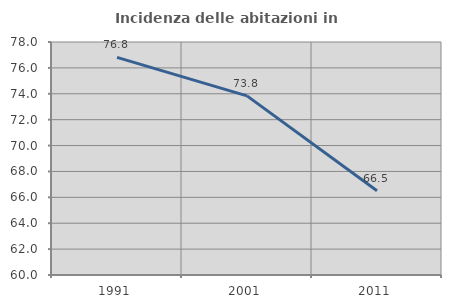
| Category | Incidenza delle abitazioni in proprietà  |
|---|---|
| 1991.0 | 76.812 |
| 2001.0 | 73.836 |
| 2011.0 | 66.512 |